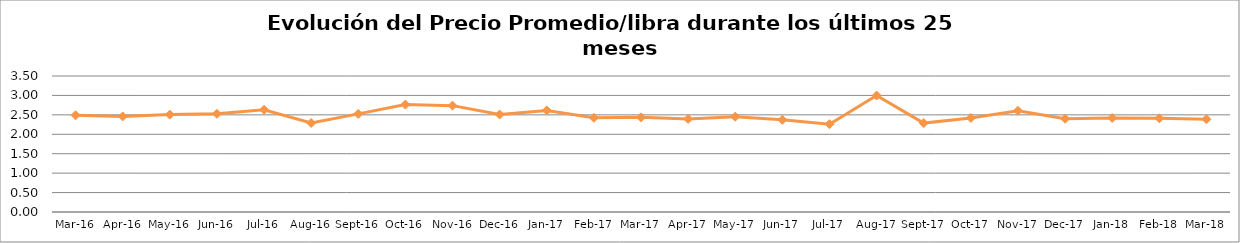
| Category | Series 0 |
|---|---|
| 2016-03-01 | 2.488 |
| 2016-04-01 | 2.46 |
| 2016-05-01 | 2.506 |
| 2016-06-01 | 2.527 |
| 2016-07-01 | 2.631 |
| 2016-08-01 | 2.292 |
| 2016-09-01 | 2.525 |
| 2016-10-01 | 2.764 |
| 2016-11-01 | 2.737 |
| 2016-12-01 | 2.508 |
| 2017-01-01 | 2.615 |
| 2017-02-01 | 2.424 |
| 2017-03-01 | 2.436 |
| 2017-04-01 | 2.396 |
| 2017-05-01 | 2.452 |
| 2017-06-01 | 2.372 |
| 2017-07-01 | 2.26 |
| 2017-08-01 | 2.997 |
| 2017-09-01 | 2.288 |
| 2017-10-01 | 2.421 |
| 2017-11-01 | 2.605 |
| 2017-12-01 | 2.4 |
| 2018-01-01 | 2.42 |
| 2018-02-01 | 2.412 |
| 2018-03-01 | 2.388 |